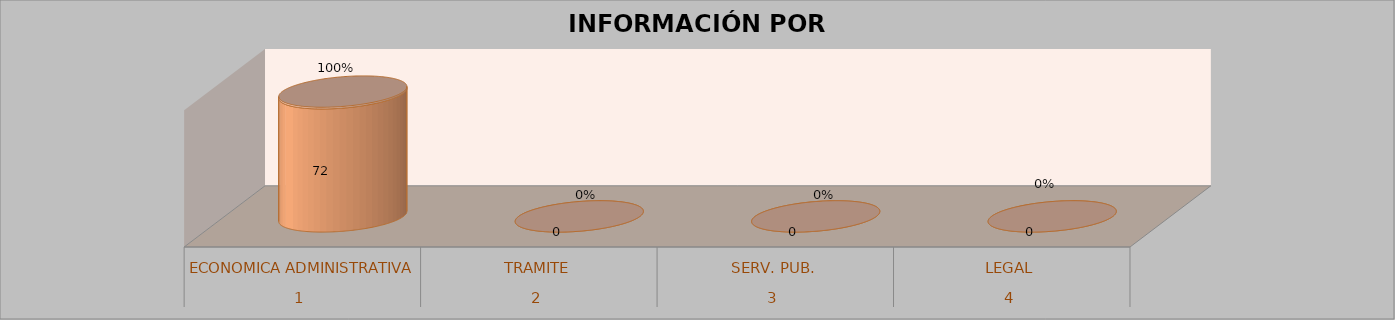
| Category | Series 0 | Series 1 | Series 2 | Series 3 |
|---|---|---|---|---|
| 0 |  |  | 72 | 1 |
| 1 |  |  | 0 | 0 |
| 2 |  |  | 0 | 0 |
| 3 |  |  | 0 | 0 |